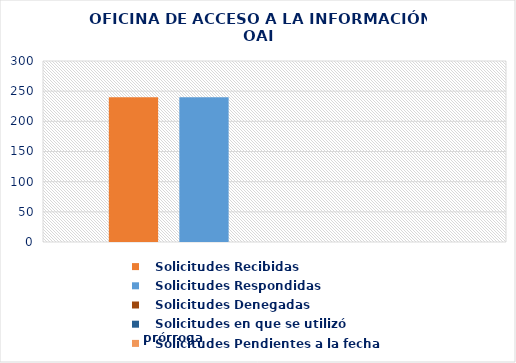
| Category |    Solicitudes Recibidas |    Solicitudes Respondidas |    Solicitudes Denegadas |    Solicitudes en que se utilizó prórroga |    Solicitudes Pendientes a la fecha |
|---|---|---|---|---|---|
| 0 | 240 | 240 | 0 | 0 | 0 |